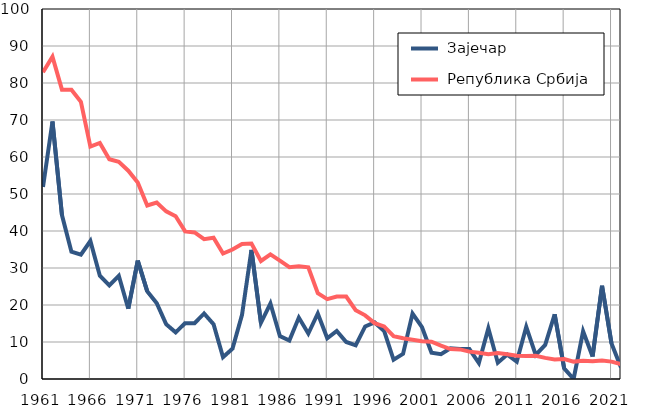
| Category |  Зајечар |  Република Србија |
|---|---|---|
| 1961.0 | 51.9 | 82.9 |
| 1962.0 | 69.6 | 87.1 |
| 1963.0 | 44.3 | 78.2 |
| 1964.0 | 34.4 | 78.2 |
| 1965.0 | 33.6 | 74.9 |
| 1966.0 | 37.3 | 62.8 |
| 1967.0 | 27.9 | 63.8 |
| 1968.0 | 25.3 | 59.4 |
| 1969.0 | 27.9 | 58.7 |
| 1970.0 | 19 | 56.3 |
| 1971.0 | 32 | 53.1 |
| 1972.0 | 23.7 | 46.9 |
| 1973.0 | 20.5 | 47.7 |
| 1974.0 | 14.8 | 45.3 |
| 1975.0 | 12.6 | 44 |
| 1976.0 | 15.1 | 39.9 |
| 1977.0 | 15.1 | 39.6 |
| 1978.0 | 17.7 | 37.8 |
| 1979.0 | 14.8 | 38.2 |
| 1980.0 | 5.9 | 33.9 |
| 1981.0 | 8.2 | 35 |
| 1982.0 | 17.3 | 36.5 |
| 1983.0 | 34.9 | 36.6 |
| 1984.0 | 15.2 | 31.9 |
| 1985.0 | 20.4 | 33.7 |
| 1986.0 | 11.6 | 32 |
| 1987.0 | 10.4 | 30.2 |
| 1988.0 | 16.6 | 30.5 |
| 1989.0 | 12.3 | 30.2 |
| 1990.0 | 17.7 | 23.2 |
| 1991.0 | 11 | 21.6 |
| 1992.0 | 13 | 22.3 |
| 1993.0 | 10 | 22.3 |
| 1994.0 | 9.1 | 18.6 |
| 1995.0 | 14.2 | 17.2 |
| 1996.0 | 15.3 | 15.1 |
| 1997.0 | 13 | 14.2 |
| 1998.0 | 5.2 | 11.6 |
| 1999.0 | 6.8 | 11 |
| 2000.0 | 17.7 | 10.6 |
| 2001.0 | 14 | 10.2 |
| 2002.0 | 7.1 | 10.1 |
| 2003.0 | 6.7 | 9 |
| 2004.0 | 8.3 | 8.1 |
| 2005.0 | 8.1 | 8 |
| 2006.0 | 8.1 | 7.4 |
| 2007.0 | 4.3 | 7.1 |
| 2008.0 | 13.7 | 6.7 |
| 2009.0 | 4.4 | 7 |
| 2010.0 | 6.6 | 6.7 |
| 2011.0 | 4.7 | 6.3 |
| 2012.0 | 14.1 | 6.2 |
| 2013.0 | 6.5 | 6.3 |
| 2014.0 | 9.2 | 5.7 |
| 2015.0 | 17.5 | 5.3 |
| 2016.0 | 2.9 | 5.4 |
| 2017.0 | 0 | 4.7 |
| 2018.0 | 12.9 | 4.9 |
| 2019.0 | 6.1 | 4.8 |
| 2020.0 | 25.2 | 5 |
| 2021.0 | 9.6 | 4.7 |
| 2022.0 | 3.1 | 4 |